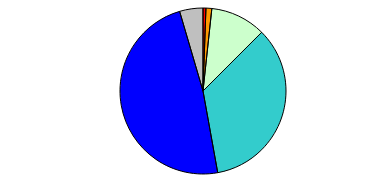
| Category | Series 0 |
|---|---|
| 0 | 1 |
| 1 | 2 |
| 2 | 19 |
| 3 | 61 |
| 4 | 85 |
| 5 | 8 |